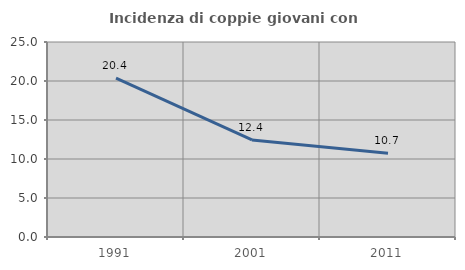
| Category | Incidenza di coppie giovani con figli |
|---|---|
| 1991.0 | 20.37 |
| 2001.0 | 12.442 |
| 2011.0 | 10.723 |